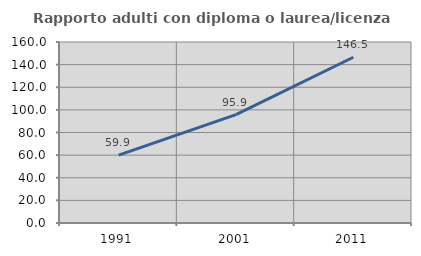
| Category | Rapporto adulti con diploma o laurea/licenza media  |
|---|---|
| 1991.0 | 59.946 |
| 2001.0 | 95.852 |
| 2011.0 | 146.495 |